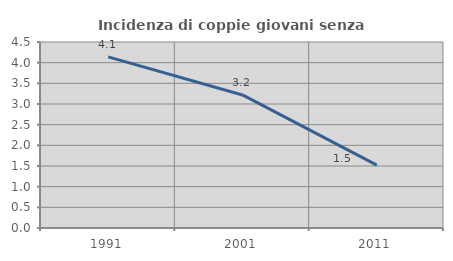
| Category | Incidenza di coppie giovani senza figli |
|---|---|
| 1991.0 | 4.139 |
| 2001.0 | 3.219 |
| 2011.0 | 1.522 |